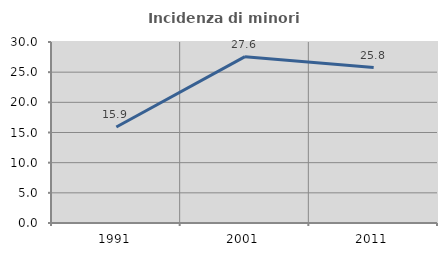
| Category | Incidenza di minori stranieri |
|---|---|
| 1991.0 | 15.909 |
| 2001.0 | 27.574 |
| 2011.0 | 25.759 |